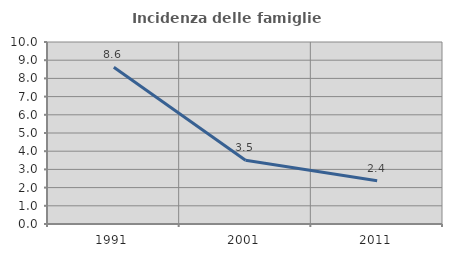
| Category | Incidenza delle famiglie numerose |
|---|---|
| 1991.0 | 8.612 |
| 2001.0 | 3.5 |
| 2011.0 | 2.38 |